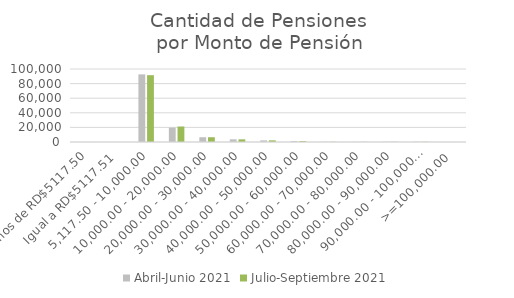
| Category | Abril-Junio 2021 | Julio-Septiembre 2021 |
|---|---|---|
| Menos de RD$5117.50 | 45 | 44 |
| Igual a RD$5117.51 | 1 | 1 |
| 5,117.50 - 10,000.00 | 92637 | 91543 |
| 10,000.00 - 20,000.00 | 19649 | 21220 |
| 20,000.00 - 30,000.00 | 6559 | 6548 |
| 30,000.00 - 40,000.00 | 3631 | 3632 |
| 40,000.00 - 50,000.00 | 2221 | 2268 |
| 50,000.00 - 60,000.00 | 1221 | 1235 |
| 60,000.00 - 70,000.00 | 264 | 278 |
| 70,000.00 - 80,000.00 | 185 | 200 |
| 80,000.00 - 90,000.00 | 254 | 285 |
| 90,000.00 - 100,000.00 | 299 | 299 |
| >=100,000.00 | 47 | 51 |